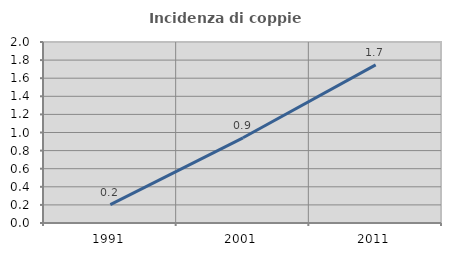
| Category | Incidenza di coppie miste |
|---|---|
| 1991.0 | 0.202 |
| 2001.0 | 0.941 |
| 2011.0 | 1.747 |